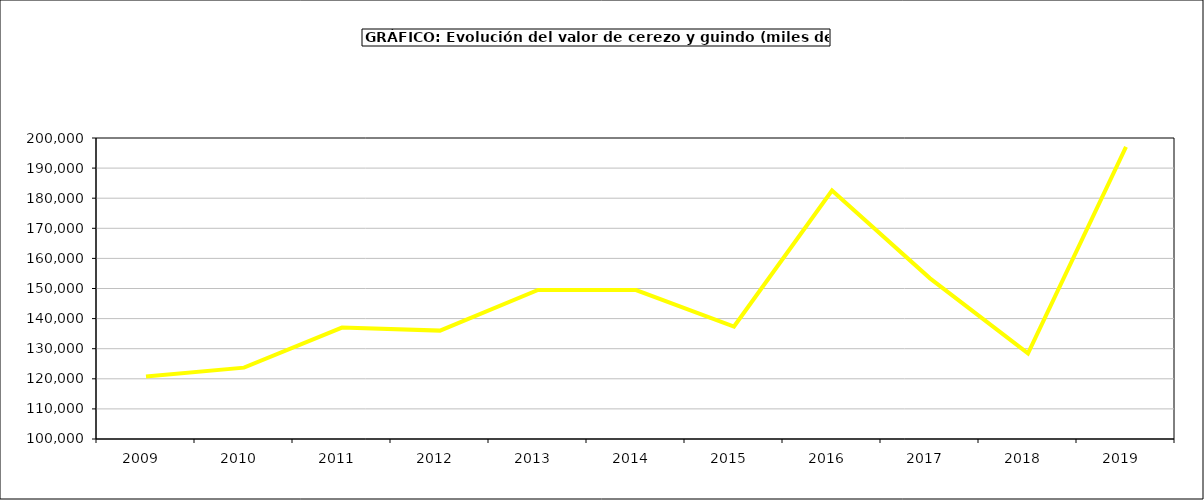
| Category | valor cerezo y guindo |
|---|---|
| 2009.0 | 120767.336 |
| 2010.0 | 123711.92 |
| 2011.0 | 137034.469 |
| 2012.0 | 136005.543 |
| 2013.0 | 149538.377 |
| 2014.0 | 149493.495 |
| 2015.0 | 137364 |
| 2016.0 | 182544 |
| 2017.0 | 153374.55 |
| 2018.0 | 128453.5 |
| 2019.0 | 197061.787 |